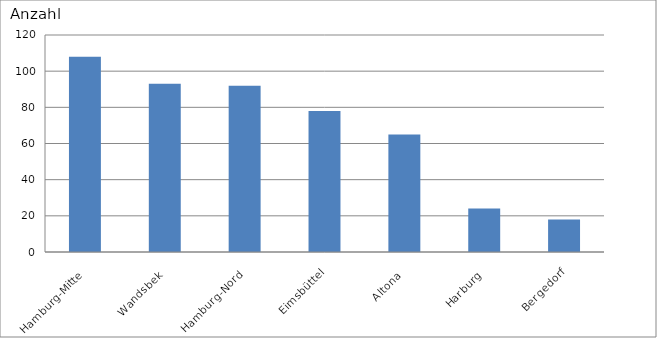
| Category | Hamburg-Mitte Wandsbek Hamburg-Nord Eimsbüttel Altona Harburg Bergedorf |
|---|---|
| Hamburg-Mitte | 108 |
| Wandsbek | 93 |
| Hamburg-Nord | 92 |
| Eimsbüttel | 78 |
| Altona | 65 |
| Harburg | 24 |
| Bergedorf | 18 |